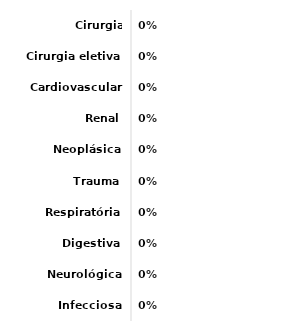
| Category | Series 0 |
|---|---|
| Infecciosa | 0 |
| Neurológica | 0 |
| Digestiva | 0 |
| Respiratória | 0 |
| Trauma | 0 |
| Neoplásica | 0 |
| Renal | 0 |
| Cardiovascular | 0 |
| Cirurgia eletiva | 0 |
| Cirurgia emergência | 0 |